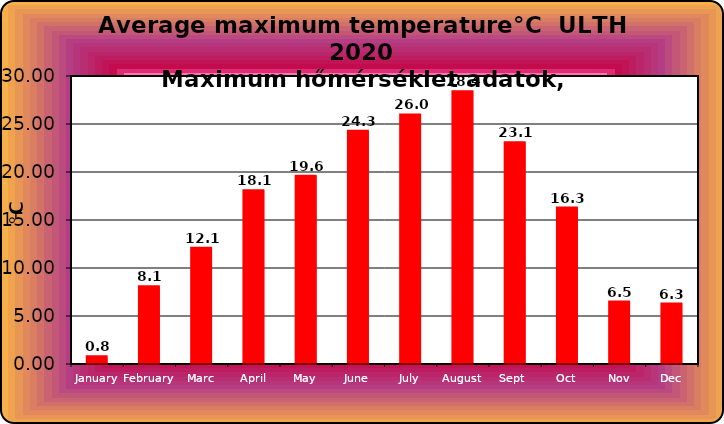
| Category | Series 0 |
|---|---|
| January | 0.8 |
| February | 8.1 |
| Marc | 12.1 |
| April | 18.1 |
| May | 19.6 |
| June | 24.3 |
| July | 26 |
| August | 28.4 |
| Sept  | 23.1 |
| Oct | 16.3 |
| Nov | 6.5 |
| Dec | 6.3 |